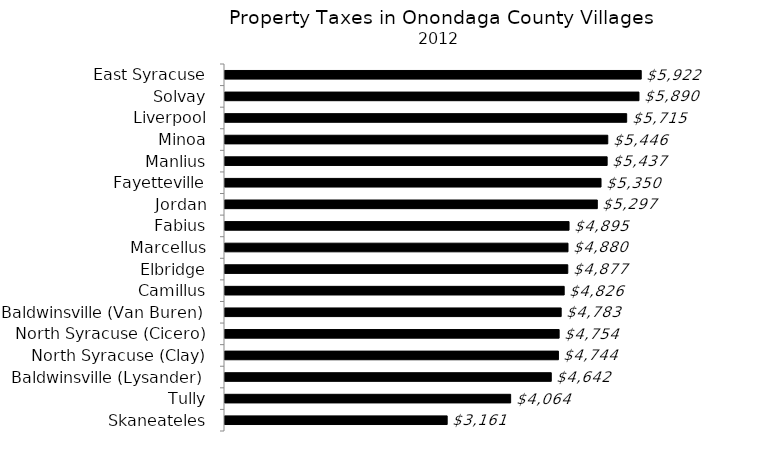
| Category | Series 0 |
|---|---|
| Skaneateles | 3161 |
| Tully | 4064 |
| Baldwinsville (Lysander) | 4642 |
| North Syracuse (Clay) | 4744 |
| North Syracuse (Cicero) | 4754 |
| Baldwinsville (Van Buren) | 4783 |
| Camillus | 4826 |
| Elbridge | 4877 |
| Marcellus | 4880 |
| Fabius | 4895 |
| Jordan | 5297 |
| Fayetteville | 5350 |
| Manlius | 5437 |
| Minoa | 5446 |
| Liverpool | 5715 |
| Solvay | 5890 |
| East Syracuse | 5922 |